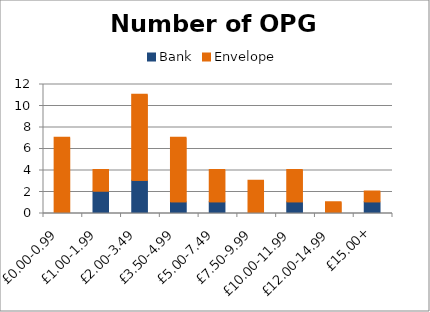
| Category | Bank | Envelope |
|---|---|---|
| £0.00-0.99 | 0 | 7 |
| £1.00-1.99 | 2 | 2 |
| £2.00-3.49 | 3 | 8 |
| £3.50-4.99 | 1 | 6 |
| £5.00-7.49 | 1 | 3 |
| £7.50-9.99 | 0 | 3 |
| £10.00-11.99 | 1 | 3 |
| £12.00-14.99 | 0 | 1 |
| £15.00+ | 1 | 1 |